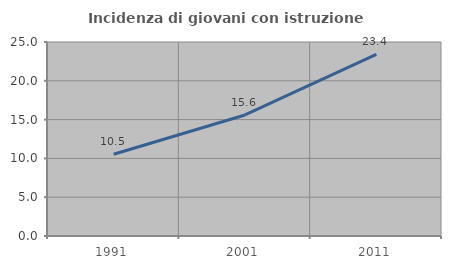
| Category | Incidenza di giovani con istruzione universitaria |
|---|---|
| 1991.0 | 10.534 |
| 2001.0 | 15.596 |
| 2011.0 | 23.404 |